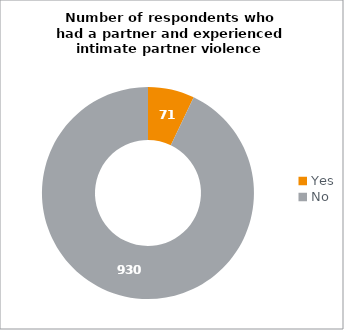
| Category | Series 1 |
|---|---|
| Yes | 71 |
| No | 930 |